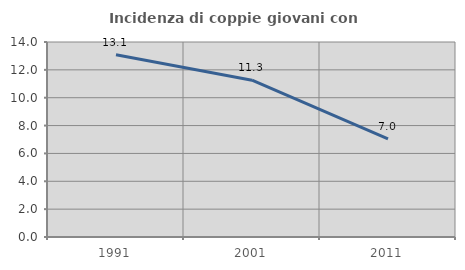
| Category | Incidenza di coppie giovani con figli |
|---|---|
| 1991.0 | 13.078 |
| 2001.0 | 11.255 |
| 2011.0 | 7.042 |